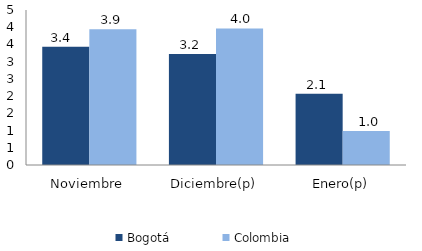
| Category | Bogotá | Colombia |
|---|---|---|
| Noviembre | 3.43 | 3.942 |
| Diciembre(p) | 3.22 | 3.965 |
| Enero(p) | 2.066 | 0.991 |